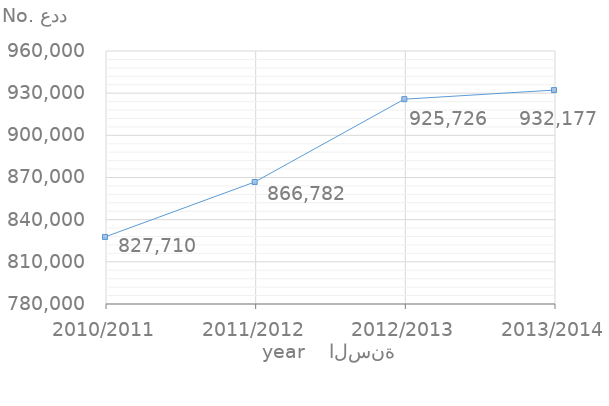
| Category | القيمة
Value |
|---|---|
| 2013/2014 | 932177 |
| 2012/2013 | 925726 |
| 2011/2012 | 866782 |
| 2010/2011 | 827710 |